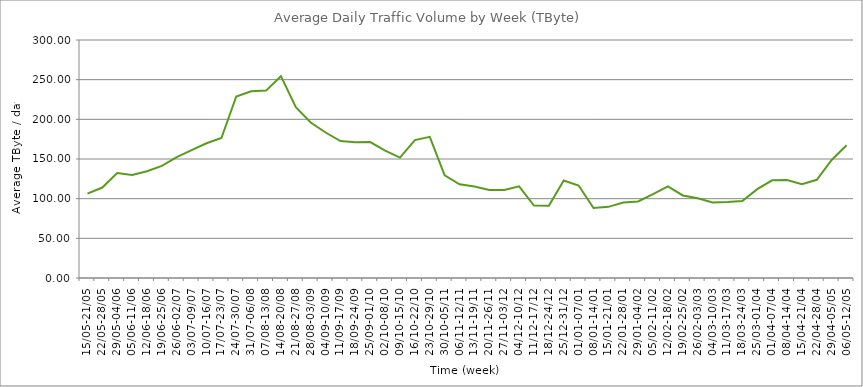
| Category | Average |
|---|---|
| 15/05-21/05 | 106.37 |
| 22/05-28/05 | 114.03 |
| 29/05-04/06 | 132.19 |
| 05/06-11/06 | 129.96 |
| 12/06-18/06 | 134.51 |
| 19/06-25/06 | 141.31 |
| 26/06-02/07 | 152.26 |
| 03/07-09/07 | 161.12 |
| 10/07-16/07 | 169.83 |
| 17/07-23/07 | 176.43 |
| 24/07-30/07 | 228.78 |
| 31/07-06/08 | 235.28 |
| 07/08-13/08 | 236.22 |
| 14/08-20/08 | 254.42 |
| 21/08-27/08 | 215.29 |
| 28/08-03/09 | 196.03 |
| 04/09-10/09 | 183.39 |
| 11/09-17/09 | 172.54 |
| 18/09-24/09 | 171.02 |
| 25/09-01/10 | 171.39 |
| 02/10-08/10 | 160.52 |
| 09/10-15/10 | 151.74 |
| 16/10-22/10 | 173.86 |
| 23/10-29/10 | 177.87 |
| 30/10-05/11 | 129.37 |
| 06/11-12/11 | 118.1 |
| 13/11-19/11 | 115.37 |
| 20/11-26/11 | 110.9 |
| 27/11-03/12 | 110.94 |
| 04/12-10/12 | 115.61 |
| 11/12-17/12 | 91.36 |
| 18/12-24/12 | 91.18 |
| 25/12-31/12 | 122.86 |
| 01/01-07/01 | 116.55 |
| 08/01-14/01 | 88.31 |
| 15/01-21/01 | 89.67 |
| 22/01-28/01 | 95.25 |
| 29/01-04/02 | 96.54 |
| 05/02-11/02 | 105.78 |
| 12/02-18/02 | 115.6 |
| 19/02-25/02 | 104.05 |
| 26/02-03/03 | 100.5 |
| 04/03-10/03 | 95.1 |
| 11/03-17/03 | 95.83 |
| 18/03-24/03 | 97.16 |
| 25/03-01/04 | 111.97 |
| 01/04-07/04 | 123.17 |
| 08/04-14/04 | 123.38 |
| 15/04-21/04 | 118.33 |
| 22/04-28/04 | 123.83 |
| 29/04-05/05 | 148.73 |
| 06/05-12/05 | 167.37 |